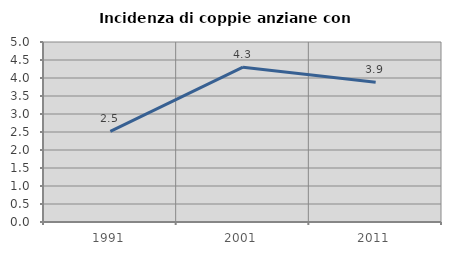
| Category | Incidenza di coppie anziane con figli |
|---|---|
| 1991.0 | 2.518 |
| 2001.0 | 4.301 |
| 2011.0 | 3.879 |